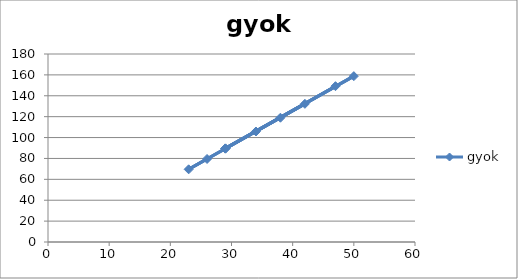
| Category | gyok |
|---|---|
| 29.0 | 89.58 |
| 50.0 | 158.797 |
| 23.0 | 69.591 |
| 26.0 | 79.488 |
| 29.0 | 89.334 |
| 34.0 | 105.789 |
| 38.0 | 118.993 |
| 42.0 | 132.283 |
| 29.0 | 89.636 |
| 47.0 | 149.184 |